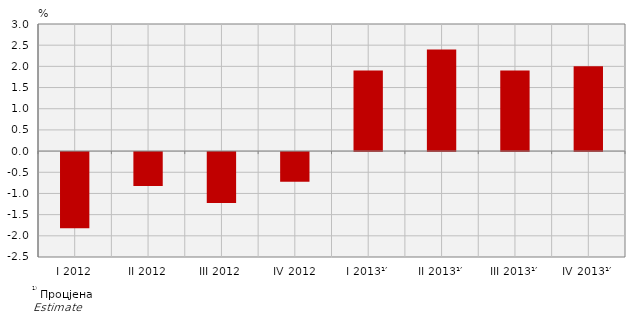
| Category | Стопе реалног раста БДП-а
Real growth rates of GDP |
|---|---|
| I 2012 | -1.8 |
| II 2012 | -0.8 |
| III 2012 | -1.2 |
| IV 2012 | -0.7 |
| I 2013¹′ | 1.9 |
| II 2013¹′ | 2.4 |
| III 2013¹′ | 1.9 |
| IV 2013¹′ | 2 |